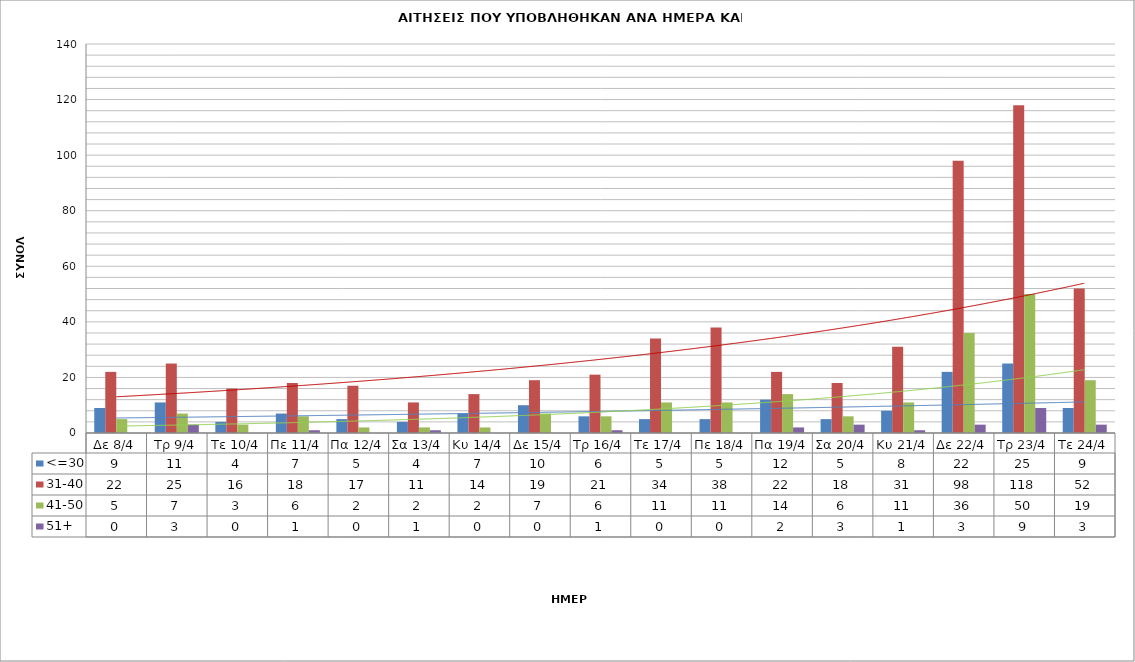
| Category | <=30 | 31-40 | 41-50 | 51+ |
|---|---|---|---|---|
| Δε 8/4 | 9 | 22 | 5 | 0 |
| Τρ 9/4 | 11 | 25 | 7 | 3 |
| Τε 10/4 | 4 | 16 | 3 | 0 |
| Πε 11/4 | 7 | 18 | 6 | 1 |
| Πα 12/4 | 5 | 17 | 2 | 0 |
| Σα 13/4 | 4 | 11 | 2 | 1 |
| Κυ 14/4 | 7 | 14 | 2 | 0 |
| Δε 15/4 | 10 | 19 | 7 | 0 |
| Τρ 16/4 | 6 | 21 | 6 | 1 |
| Τε 17/4 | 5 | 34 | 11 | 0 |
| Πε 18/4 | 5 | 38 | 11 | 0 |
| Πα 19/4 | 12 | 22 | 14 | 2 |
| Σα 20/4 | 5 | 18 | 6 | 3 |
| Κυ 21/4 | 8 | 31 | 11 | 1 |
| Δε 22/4 | 22 | 98 | 36 | 3 |
| Τρ 23/4 | 25 | 118 | 50 | 9 |
| Τε 24/4 | 9 | 52 | 19 | 3 |